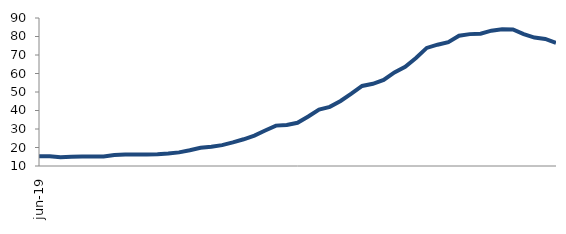
| Category | Series 0 |
|---|---|
| 2019-06-01 | 15.27 |
| 2019-07-01 | 15.317 |
| 2019-08-01 | 14.744 |
| 2019-09-01 | 15.056 |
| 2019-10-01 | 15.116 |
| 2019-11-01 | 15.185 |
| 2019-12-01 | 15.165 |
| 2020-01-01 | 15.917 |
| 2020-02-01 | 16.225 |
| 2020-03-01 | 16.228 |
| 2020-04-01 | 16.172 |
| 2020-05-01 | 16.362 |
| 2020-06-01 | 16.723 |
| 2020-07-01 | 17.365 |
| 2020-08-01 | 18.526 |
| 2020-09-01 | 19.846 |
| 2020-10-01 | 20.404 |
| 2020-11-01 | 21.294 |
| 2020-12-01 | 22.781 |
| 2021-01-01 | 24.447 |
| 2021-02-01 | 26.406 |
| 2021-03-01 | 29.172 |
| 2021-04-01 | 31.839 |
| 2021-05-01 | 32.208 |
| 2021-06-01 | 33.334 |
| 2021-07-01 | 36.745 |
| 2021-08-01 | 40.523 |
| 2021-09-01 | 41.963 |
| 2021-10-01 | 45.141 |
| 2021-11-01 | 49.115 |
| 2021-12-01 | 53.284 |
| 2022-01-01 | 54.418 |
| 2022-02-01 | 56.487 |
| 2022-03-01 | 60.62 |
| 2022-04-01 | 63.634 |
| 2022-05-01 | 68.377 |
| 2022-06-01 | 73.83 |
| 2022-07-01 | 75.57 |
| 2022-08-01 | 76.97 |
| 2022-09-01 | 80.415 |
| 2022-10-01 | 81.287 |
| 2022-11-01 | 81.539 |
| 2022-12-01 | 83.165 |
| 2023-01-01 | 83.881 |
| 2023-02-01 | 83.774 |
| 2023-03-01 | 81.297 |
| 2023-04-01 | 79.408 |
| 2023-05-01 | 78.7 |
| 2023-06-01 | 76.589 |